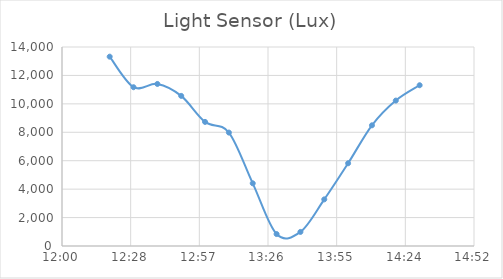
| Category | Light Sensor (Lux) |
|---|---|
| 0.513888888888889 | 13320 |
| 0.520833333333333 | 11170 |
| 0.527777777777778 | 11400 |
| 0.534722222222222 | 10560 |
| 0.541666666666667 | 8730 |
| 0.548611111111111 | 7980 |
| 0.555555555555556 | 4410 |
| 0.5625 | 840 |
| 0.569444444444444 | 990 |
| 0.576388888888889 | 3280 |
| 0.583333333333333 | 5820 |
| 0.590277777777778 | 8490 |
| 0.597222222222222 | 10230 |
| 0.604166666666667 | 11310 |